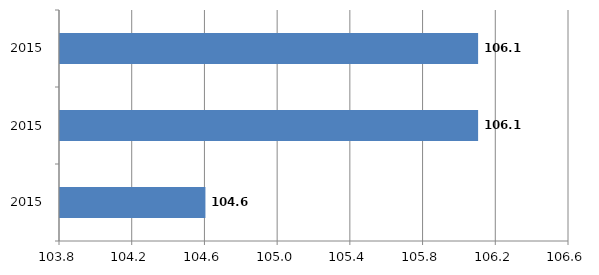
| Category | Series 0 |
|---|---|
| 2015.0 | 104.6 |
| 2015.0 | 106.1 |
| 2015.0 | 106.1 |